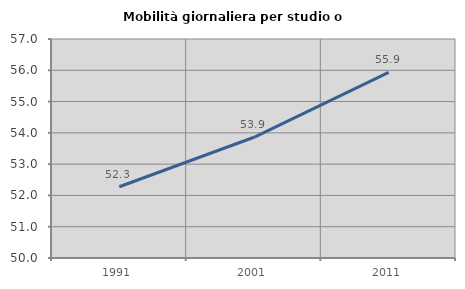
| Category | Mobilità giornaliera per studio o lavoro |
|---|---|
| 1991.0 | 52.277 |
| 2001.0 | 53.859 |
| 2011.0 | 55.932 |